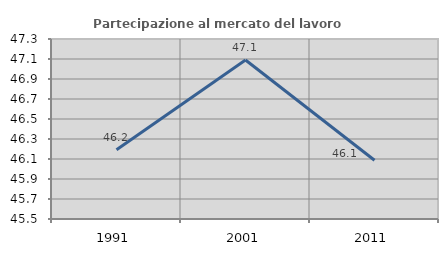
| Category | Partecipazione al mercato del lavoro  femminile |
|---|---|
| 1991.0 | 46.192 |
| 2001.0 | 47.09 |
| 2011.0 | 46.087 |